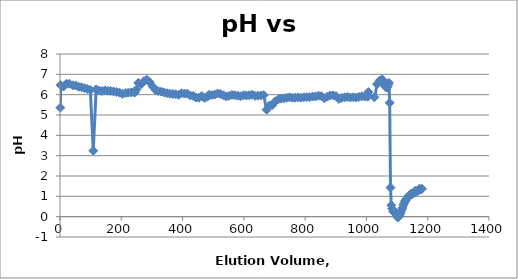
| Category | pH |
|---|---|
| 1.0 | 5.36 |
| 2.0 | 6.47 |
| 11.5 | 6.4 |
| 20.9 | 6.54 |
| 30.5 | 6.54 |
| 42.1 | 6.46 |
| 51.3 | 6.45 |
| 60.9 | 6.39 |
| 70.5 | 6.36 |
| 80.1 | 6.32 |
| 89.3 | 6.28 |
| 98.89999999999999 | 6.23 |
| 108.49999999999999 | 3.24 |
| 118.09999999999998 | 6.26 |
| 127.49999999999999 | 6.2 |
| 137.0 | 6.18 |
| 146.4 | 6.21 |
| 155.9 | 6.19 |
| 165.0 | 6.18 |
| 174.6 | 6.16 |
| 184.29999999999998 | 6.13 |
| 193.99999999999997 | 6.1 |
| 203.39999999999998 | 6.04 |
| 212.99999999999997 | 6.08 |
| 222.49999999999997 | 6.1 |
| 232.09999999999997 | 6.11 |
| 240.49999999999997 | 6.13 |
| 244.49999999999997 | 6.11 |
| 249.39999999999998 | 6.25 |
| 255.7 | 6.58 |
| 264.9 | 6.52 |
| 274.2 | 6.67 |
| 283.4 | 6.73 |
| 292.7 | 6.62 |
| 302.2 | 6.4 |
| 311.8 | 6.23 |
| 321.2 | 6.17 |
| 330.5 | 6.15 |
| 339.8 | 6.11 |
| 349.2 | 6.07 |
| 358.59999999999997 | 6.05 |
| 368.29999999999995 | 6.03 |
| 377.59999999999997 | 6.02 |
| 387.09999999999997 | 5.99 |
| 396.49999999999994 | 6.07 |
| 406.09999999999997 | 6.05 |
| 415.4 | 6.05 |
| 425.2 | 5.96 |
| 434.5 | 5.94 |
| 443.9 | 5.86 |
| 453.2 | 5.85 |
| 462.5 | 5.93 |
| 471.9 | 5.84 |
| 481.4 | 5.9 |
| 486.09999999999997 | 5.99 |
| 495.4 | 5.98 |
| 504.79999999999995 | 6 |
| 514.1999999999999 | 6.06 |
| 523.6999999999999 | 6.03 |
| 533.1999999999999 | 5.97 |
| 542.4 | 5.91 |
| 551.6999999999999 | 5.94 |
| 561.3 | 5.99 |
| 570.6999999999999 | 5.97 |
| 580.1999999999999 | 5.95 |
| 589.6999999999999 | 5.92 |
| 599.0999999999999 | 5.97 |
| 608.3999999999999 | 5.96 |
| 617.7999999999998 | 5.97 |
| 627.1999999999998 | 6 |
| 636.4999999999998 | 5.94 |
| 646.0999999999998 | 5.95 |
| 655.4999999999998 | 5.96 |
| 664.7999999999997 | 5.98 |
| 674.1999999999997 | 5.26 |
| 683.5999999999997 | 5.47 |
| 692.9999999999997 | 5.49 |
| 702.3999999999996 | 5.67 |
| 711.7999999999996 | 5.76 |
| 721.0999999999996 | 5.81 |
| 730.3999999999995 | 5.82 |
| 739.7999999999995 | 5.85 |
| 749.0999999999995 | 5.87 |
| 758.2999999999995 | 5.85 |
| 767.3999999999995 | 5.85 |
| 776.6999999999995 | 5.87 |
| 786.1999999999995 | 5.85 |
| 795.6999999999995 | 5.87 |
| 805.1999999999995 | 5.88 |
| 814.8999999999995 | 5.88 |
| 824.4999999999995 | 5.91 |
| 834.0999999999996 | 5.91 |
| 843.4999999999995 | 5.95 |
| 852.7999999999995 | 5.93 |
| 862.6999999999995 | 5.82 |
| 872.1999999999995 | 5.9 |
| 881.6999999999995 | 5.96 |
| 891.1999999999995 | 5.97 |
| 900.7999999999995 | 5.93 |
| 910.1999999999995 | 5.79 |
| 919.5999999999995 | 5.84 |
| 929.1999999999995 | 5.87 |
| 938.5999999999995 | 5.89 |
| 947.8999999999994 | 5.86 |
| 957.2999999999994 | 5.87 |
| 966.6999999999994 | 5.86 |
| 975.9999999999993 | 5.89 |
| 985.2999999999993 | 5.92 |
| 994.5999999999992 | 5.91 |
| 1003.8999999999992 | 5.9 |
| 1006.2999999999992 | 6.13 |
| 1025.7999999999993 | 5.87 |
| 1034.4999999999993 | 6.52 |
| 1043.6999999999994 | 6.7 |
| 1051.0999999999995 | 6.75 |
| 1053.7999999999995 | 6.71 |
| 1056.4999999999995 | 6.58 |
| 1059.2999999999995 | 6.46 |
| 1062.1999999999996 | 6.4 |
| 1064.9999999999995 | 6.35 |
| 1067.7999999999995 | 6.36 |
| 1070.4999999999995 | 6.47 |
| 1073.2999999999995 | 6.58 |
| 1075.8999999999994 | 5.6 |
| 1078.4999999999993 | 1.43 |
| 1081.1999999999994 | 0.56 |
| 1083.9999999999993 | 0.39 |
| 1087.1999999999994 | 0.26 |
| 1089.9999999999993 | 0.28 |
| 1092.7999999999993 | 0.19 |
| 1095.4999999999993 | 0.18 |
| 1098.1999999999994 | 0.09 |
| 1100.8999999999994 | -0.02 |
| 1103.6999999999994 | -0.03 |
| 1106.5999999999995 | 0.02 |
| 1109.2999999999995 | 0.11 |
| 1112.1999999999996 | 0.21 |
| 1114.9999999999995 | 0.33 |
| 1117.6999999999996 | 0.43 |
| 1120.4999999999995 | 0.57 |
| 1123.2999999999995 | 0.67 |
| 1125.9999999999995 | 0.77 |
| 1128.7999999999995 | 0.82 |
| 1131.5999999999995 | 0.88 |
| 1134.2999999999995 | 0.94 |
| 1136.9999999999995 | 1.01 |
| 1139.5999999999995 | 1.03 |
| 1142.2999999999995 | 1.07 |
| 1144.9999999999995 | 1.12 |
| 1147.7999999999995 | 1.09 |
| 1150.6999999999996 | 1.14 |
| 1153.4999999999995 | 1.16 |
| 1156.2999999999995 | 1.18 |
| 1158.9999999999995 | 1.27 |
| 1161.8999999999996 | 1.23 |
| 1164.7999999999997 | 1.25 |
| 1167.5999999999997 | 1.28 |
| 1170.3999999999996 | 1.29 |
| 1172.9999999999995 | 1.37 |
| 1175.7999999999995 | 1.34 |
| 1178.5999999999995 | 1.35 |
| 1181.2999999999995 | 1.37 |